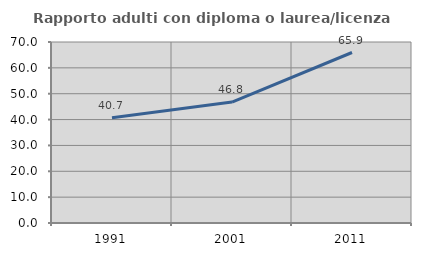
| Category | Rapporto adulti con diploma o laurea/licenza media  |
|---|---|
| 1991.0 | 40.722 |
| 2001.0 | 46.763 |
| 2011.0 | 65.939 |